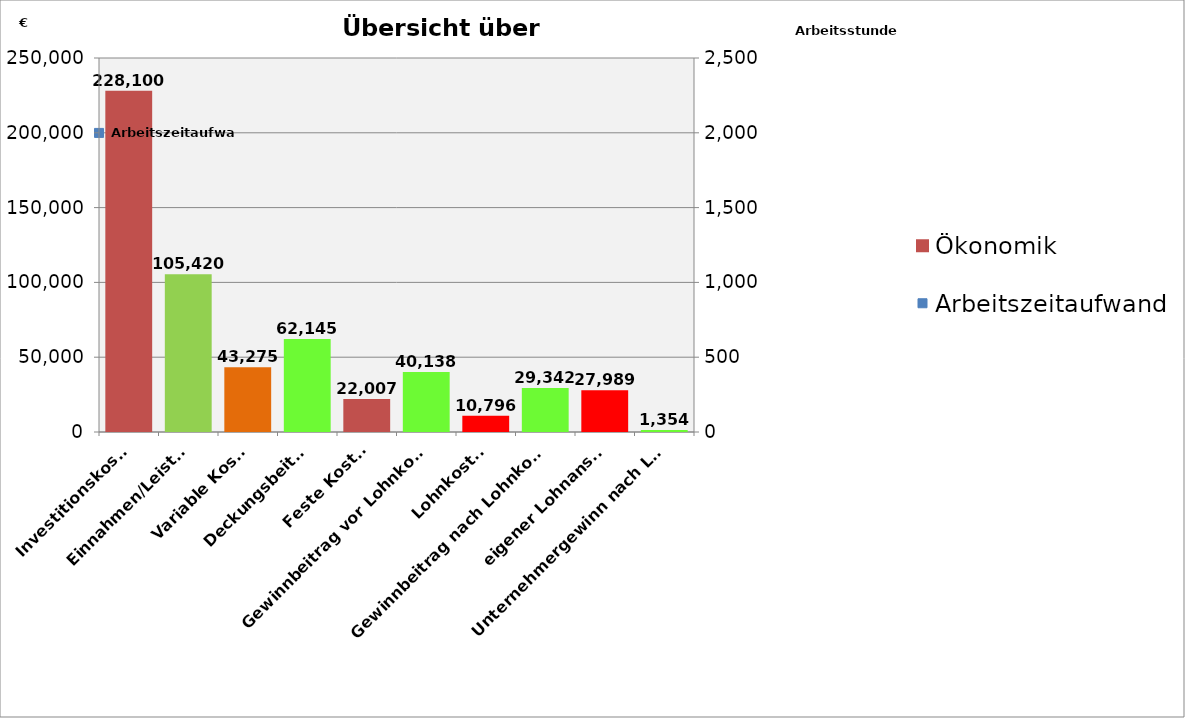
| Category | Ökonomik |
|---|---|
| Investitionskosten | 228100 |
| Einnahmen/Leistung | 105420 |
| Variable Kosten | 43274.91 |
| Deckungsbeitrag | 62145.09 |
| Feste Kosten | 22007 |
| Gewinnbeitrag vor Lohnkosten | 40138.09 |
| Lohnkosten | 10795.68 |
| Gewinnbeitrag nach Lohnkosten | 29342.41 |
| eigener Lohnansatz | 27988.8 |
| Unternehmergewinn nach Lohnansatz | 1353.61 |